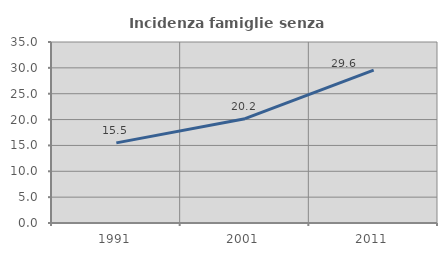
| Category | Incidenza famiglie senza nuclei |
|---|---|
| 1991.0 | 15.493 |
| 2001.0 | 20.166 |
| 2011.0 | 29.558 |